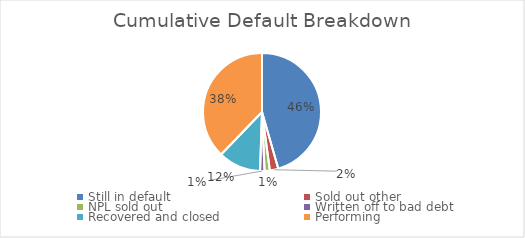
| Category | Cumulative Default Breakdown |
|---|---|
| Still in default | 0.455 |
| Sold out other | 0.023 |
| NPL sold out | 0.014 |
| Written off to bad debt | 0.012 |
| Recovered and closed | 0.117 |
| Performing | 0.378 |